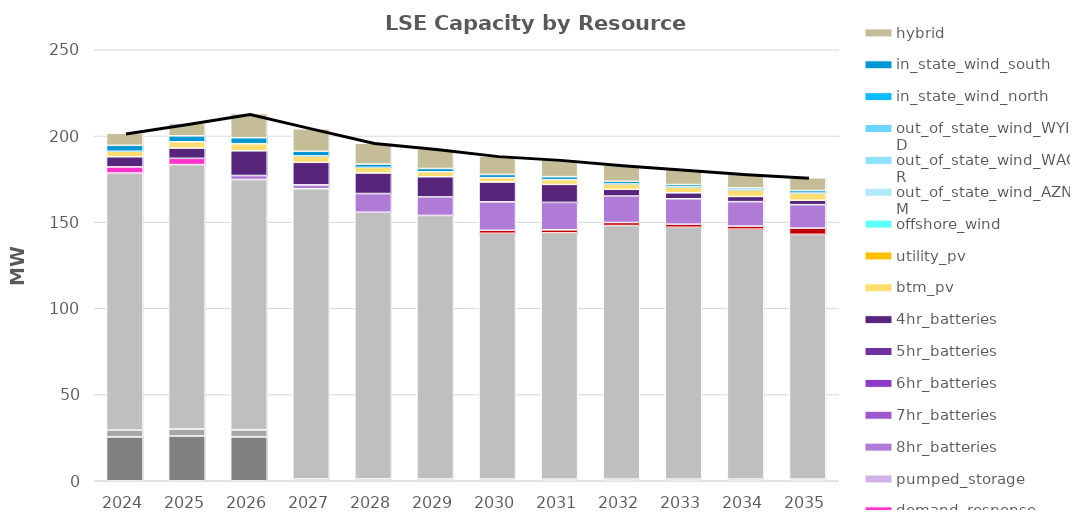
| Category | unspecified_import | steam | coal | ice | cogen | gas_ct | gas_cc | nuclear | biogas | biomass_wood | geothermal | small_hydro | hydro | demand_response | pumped_storage | 8hr_batteries | 7hr_batteries | 6hr_batteries | 5hr_batteries | 4hr_batteries | btm_pv | utility_pv | offshore_wind | out_of_state_wind_AZNM | out_of_state_wind_WAOR | out_of_state_wind_WYID | in_state_wind_north | in_state_wind_south | hybrid |
|---|---|---|---|---|---|---|---|---|---|---|---|---|---|---|---|---|---|---|---|---|---|---|---|---|---|---|---|---|---|
| 2024.0 | 0 | 0 | 0 | 0 | 25.419 | 3.943 | 149.131 | 0 | 0 | 0 | 0 | 0 | 0 | 3.572 | 0 | 0 | 0 | 0 | 0 | 5.864 | 3.19 | 0 | 0 | 0 | 0 | 0 | 0 | 3.448 | 6.955 |
| 2025.0 | 0 | 0 | 0 | 0 | 25.962 | 4.013 | 153.404 | 0 | 0 | 0 | 0 | 0 | 0 | 3.633 | 0 | 0 | 0 | 0 | 0 | 5.973 | 3.628 | 0 | 0 | 0 | 0 | 0 | 0 | 3.465 | 7.142 |
| 2026.0 | 0 | 0 | 0 | 0 | 25.422 | 4.083 | 145.215 | 0 | 0 | 0 | 0 | 0 | 0 | 0 | 0 | 2.325 | 0 | 0 | 0 | 14.344 | 4.105 | 0 | 0 | 0 | 0 | 0 | 0 | 3.483 | 13.982 |
| 2027.0 | 0 | 0 | 0 | 0 | 0.124 | 0.936 | 168.329 | 0 | 0 | 0 | 0 | 0 | 0 | 0 | 0 | 2.248 | 0 | 0 | 0 | 13.066 | 3.709 | 0 | 0 | 0 | 0 | 0 | 0 | 2.705 | 13.032 |
| 2028.0 | 0 | 0 | 0 | 0 | 0.12 | 0.931 | 154.693 | 0 | 0 | 0 | 0 | 0 | 0 | 0 | 0 | 10.85 | 0 | 0 | 0 | 11.945 | 3.225 | 0 | 0 | 0 | 0 | 0 | 0 | 1.927 | 12.081 |
| 2029.0 | 0 | 0 | 0 | 0 | 0.12 | 0.913 | 152.857 | 0 | 0 | 0 | 0 | 0 | 0 | 0 | 0 | 10.719 | 0 | 0 | 0 | 11.729 | 2.887 | 0 | 0 | 0 | 0 | 0 | 0 | 1.904 | 11.352 |
| 2030.0 | 0 | 0 | 0 | 0 | 0.12 | 0.895 | 142.516 | 0 | 0 | 0 | 1.747 | 0 | 0 | 0 | 0 | 16.516 | 0 | 0 | 0 | 11.513 | 2.479 | 0 | 0 | 0 | 0 | 0 | 0 | 1.882 | 10.622 |
| 2031.0 | 0 | 0 | 0 | 0 | 0 | 0.906 | 142.873 | 0 | 0 | 0 | 1.761 | 0 | 0 | 0 | 0 | 15.928 | 0 | 0 | 0 | 10.45 | 2.772 | 0 | 0 | 0 | 0 | 0 | 0 | 1.708 | 9.974 |
| 2032.0 | 0 | 0 | 0 | 0 | 0 | 0.917 | 147.119 | 0 | 0 | 0 | 1.774 | 0 | 0 | 0 | 0 | 15.339 | 0 | 0 | 0 | 3.92 | 3.086 | 0 | 0 | 0 | 0 | 0 | 0 | 1.535 | 9.326 |
| 2033.0 | 0 | 0 | 0 | 0 | 0 | 0.928 | 146.1 | 0 | 0 | 0 | 1.788 | 0 | 0 | 0 | 0 | 14.75 | 0 | 0 | 0 | 3.455 | 3.421 | 0 | 0 | 0 | 0 | 0 | 0 | 1.362 | 8.678 |
| 2034.0 | 0 | 0 | 0 | 0 | 0 | 0.939 | 144.995 | 0 | 0 | 0 | 1.802 | 0 | 0 | 0 | 0 | 14.161 | 0 | 0 | 0 | 3.013 | 3.776 | 0 | 0 | 0 | 0 | 0 | 0 | 1.189 | 8.03 |
| 2035.0 | 0 | 0 | 0 | 0 | 0 | 0.95 | 141.977 | 0 | 0 | 0 | 3.632 | 0 | 0 | 0 | 0 | 13.572 | 0 | 0 | 0 | 2.572 | 4.15 | 0 | 0 | 0 | 0 | 0 | 0 | 1.486 | 7.382 |